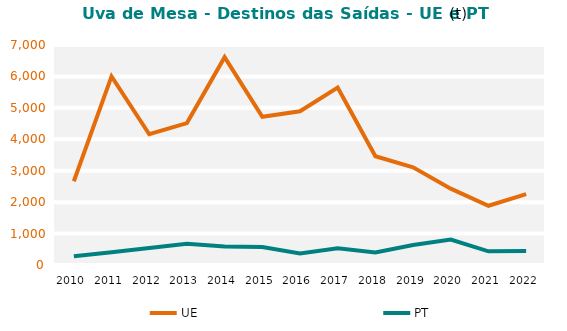
| Category | UE | PT |
|---|---|---|
| 2010.0 | 2665.536 | 275.865 |
| 2011.0 | 6001.346 | 404.4 |
| 2012.0 | 4160.545 | 540.239 |
| 2013.0 | 4516.707 | 674.008 |
| 2014.0 | 6611.927 | 590.895 |
| 2015.0 | 4717.547 | 575.031 |
| 2016.0 | 4892.386 | 369.678 |
| 2017.0 | 5648.755 | 535.499 |
| 2018.0 | 3461.848 | 401.651 |
| 2019.0 | 3108.248 | 637.388 |
| 2020.0 | 2428.356 | 809.316 |
| 2021.0 | 1884.982 | 435.109 |
| 2022.0 | 2257.026 | 447.564 |